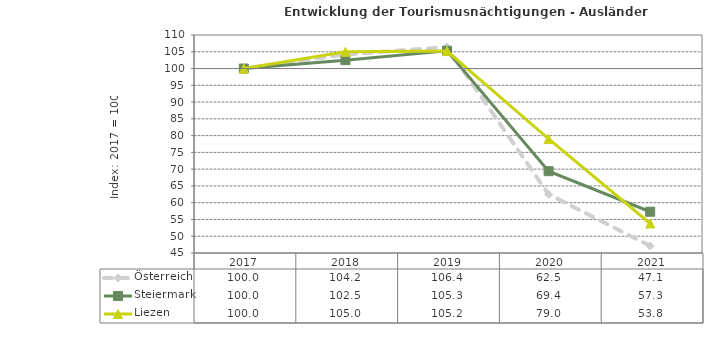
| Category | Österreich | Steiermark | Liezen |
|---|---|---|---|
| 2021.0 | 47.1 | 57.3 | 53.8 |
| 2020.0 | 62.5 | 69.4 | 79 |
| 2019.0 | 106.4 | 105.3 | 105.2 |
| 2018.0 | 104.2 | 102.5 | 105 |
| 2017.0 | 100 | 100 | 100 |